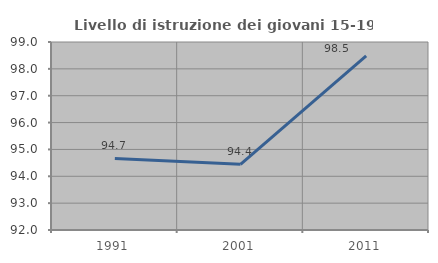
| Category | Livello di istruzione dei giovani 15-19 anni |
|---|---|
| 1991.0 | 94.667 |
| 2001.0 | 94.444 |
| 2011.0 | 98.485 |